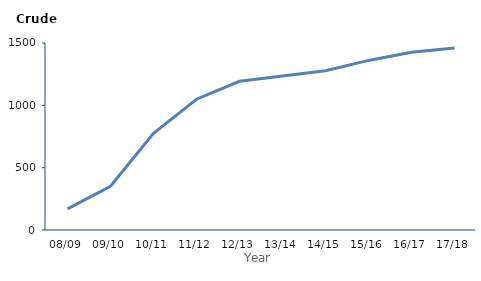
| Category | Crude rate |
|---|---|
| 08/09 | 169 |
| 09/10 | 351 |
| 10/11 | 776 |
| 11/12 | 1049 |
| 12/13 | 1193 |
| 13/14 | 1234.9 |
| 14/15 | 1277.5 |
| 15/16 | 1360.3 |
| 16/17 | 1426.5 |
| 17/18 | 1460.7 |